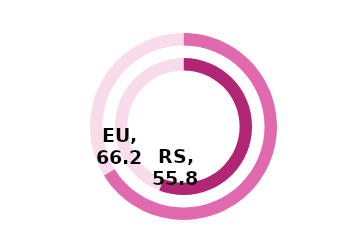
| Category | RS | Series 1 | EU |
|---|---|---|---|
| Index | 55.8 |  | 66.2 |
| Rest | 44.2 |  | 33.8 |